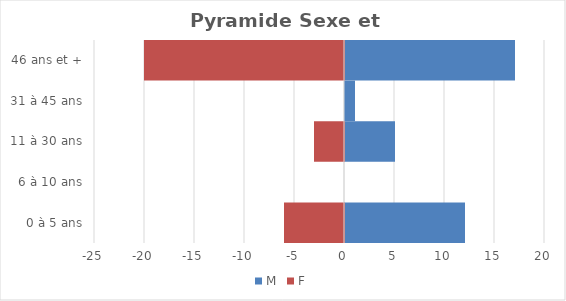
| Category | M | F |
|---|---|---|
| 0 à 5 ans | 12 | -6 |
| 6 à 10 ans | 0 | 0 |
| 11 à 30 ans | 5 | -3 |
| 31 à 45 ans | 1 | 0 |
| 46 ans et + | 17 | -20 |